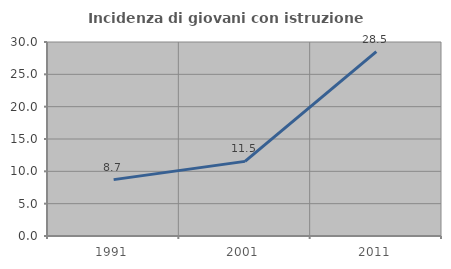
| Category | Incidenza di giovani con istruzione universitaria |
|---|---|
| 1991.0 | 8.717 |
| 2001.0 | 11.538 |
| 2011.0 | 28.508 |